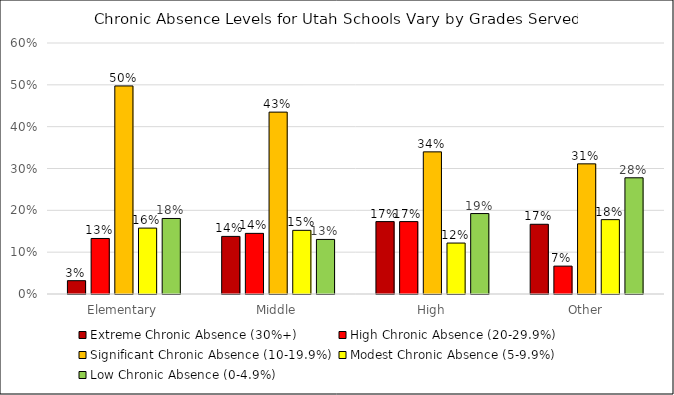
| Category | Extreme Chronic Absence (30%+) | High Chronic Absence (20-29.9%) | Significant Chronic Absence (10-19.9%) | Modest Chronic Absence (5-9.9%) | Low Chronic Absence (0-4.9%) |
|---|---|---|---|---|---|
| Elementary | 0.032 | 0.133 | 0.497 | 0.158 | 0.181 |
| Middle | 0.138 | 0.145 | 0.435 | 0.152 | 0.13 |
| High | 0.173 | 0.173 | 0.34 | 0.122 | 0.192 |
| Other | 0.167 | 0.067 | 0.311 | 0.178 | 0.278 |